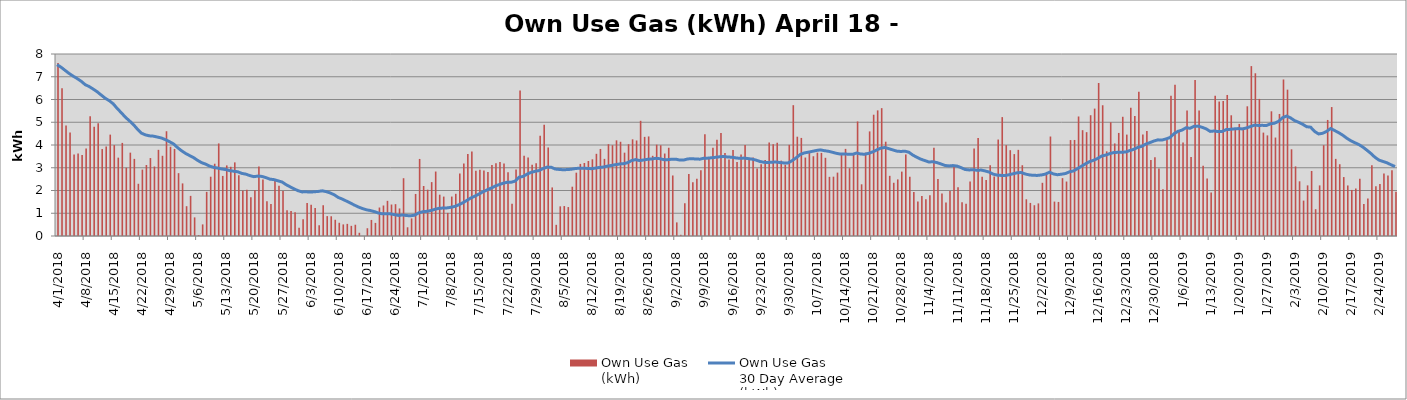
| Category | Own Use Gas
(kWh) |
|---|---|
| 4/1/18 | 7604219 |
| 4/2/18 | 6491744 |
| 4/3/18 | 4853061 |
| 4/4/18 | 4548355 |
| 4/5/18 | 3579529 |
| 4/6/18 | 3626281 |
| 4/7/18 | 3556372 |
| 4/8/18 | 3841883 |
| 4/9/18 | 5265679 |
| 4/10/18 | 4807054 |
| 4/11/18 | 4959534 |
| 4/12/18 | 3821856 |
| 4/13/18 | 3934795 |
| 4/14/18 | 4456419 |
| 4/15/18 | 3995686 |
| 4/16/18 | 3444380 |
| 4/17/18 | 4092522 |
| 4/18/18 | 2999712 |
| 4/19/18 | 3664195 |
| 4/20/18 | 3390440 |
| 4/21/18 | 2295820 |
| 4/22/18 | 2918571 |
| 4/23/18 | 3119473 |
| 4/24/18 | 3425965 |
| 4/25/18 | 3055632 |
| 4/26/18 | 3787600 |
| 4/27/18 | 3525448 |
| 4/28/18 | 4605379 |
| 4/29/18 | 3923695 |
| 4/30/18 | 3827817 |
| 5/1/18 | 2762231 |
| 5/2/18 | 2312007 |
| 5/3/18 | 1310460 |
| 5/4/18 | 1764184 |
| 5/5/18 | 818415 |
| 5/6/18 | 40935 |
| 5/7/18 | 510015 |
| 5/8/18 | 1940158 |
| 5/9/18 | 2606521 |
| 5/10/18 | 3176745 |
| 5/11/18 | 4069107 |
| 5/12/18 | 2640340 |
| 5/13/18 | 3103173 |
| 5/14/18 | 3042330 |
| 5/15/18 | 3236328 |
| 5/16/18 | 2675160 |
| 5/17/18 | 1992898 |
| 5/18/18 | 2037327 |
| 5/19/18 | 1704610 |
| 5/20/18 | 2014479 |
| 5/21/18 | 3053999 |
| 5/22/18 | 2483233 |
| 5/23/18 | 1526994 |
| 5/24/18 | 1411165 |
| 5/25/18 | 2440674 |
| 5/26/18 | 2206250 |
| 5/27/18 | 1974225 |
| 5/28/18 | 1132292 |
| 5/29/18 | 1096446 |
| 5/30/18 | 1046477 |
| 5/31/18 | 361289 |
| 6/1/18 | 736094 |
| 6/2/18 | 1445361 |
| 6/3/18 | 1376812 |
| 6/4/18 | 1236150 |
| 6/5/18 | 468116 |
| 6/6/18 | 1349756 |
| 6/7/18 | 874505 |
| 6/8/18 | 867596 |
| 6/9/18 | 713408 |
| 6/10/18 | 581199 |
| 6/11/18 | 509489 |
| 6/12/18 | 533323 |
| 6/13/18 | 446321 |
| 6/14/18 | 495564 |
| 6/15/18 | 141900 |
| 6/16/18 | 0 |
| 6/17/18 | 341236 |
| 6/18/18 | 706149 |
| 6/19/18 | 576444 |
| 6/20/18 | 1251931 |
| 6/21/18 | 1341003 |
| 6/22/18 | 1545623 |
| 6/23/18 | 1383666 |
| 6/24/18 | 1399827 |
| 6/25/18 | 1211586 |
| 6/26/18 | 2539997 |
| 6/27/18 | 383186 |
| 6/28/18 | 773649 |
| 6/29/18 | 1848006 |
| 6/30/18 | 3387473 |
| 7/1/18 | 2199074 |
| 7/2/18 | 2036537 |
| 7/3/18 | 2368815 |
| 7/4/18 | 2833727 |
| 7/5/18 | 1816616 |
| 7/6/18 | 1733027 |
| 7/7/18 | 1015840 |
| 7/8/18 | 1733887 |
| 7/9/18 | 1854871 |
| 7/10/18 | 2742476 |
| 7/11/18 | 3182385 |
| 7/12/18 | 3609624 |
| 7/13/18 | 3716606 |
| 7/14/18 | 2863848 |
| 7/15/18 | 2913521 |
| 7/16/18 | 2882423 |
| 7/17/18 | 2807698 |
| 7/18/18 | 3119470 |
| 7/19/18 | 3201291 |
| 7/20/18 | 3254406 |
| 7/21/18 | 3182465 |
| 7/22/18 | 2801926 |
| 7/23/18 | 1416890 |
| 7/24/18 | 2918461 |
| 7/25/18 | 6392683 |
| 7/26/18 | 3529647 |
| 7/27/18 | 3450588 |
| 7/28/18 | 3127002 |
| 7/29/18 | 3194970 |
| 7/30/18 | 4410029 |
| 7/31/18 | 4891461 |
| 8/1/18 | 3891495 |
| 8/2/18 | 2135240 |
| 8/3/18 | 491338 |
| 8/4/18 | 1303550 |
| 8/5/18 | 1316972 |
| 8/6/18 | 1272202 |
| 8/7/18 | 2166942 |
| 8/8/18 | 2783573 |
| 8/9/18 | 3168484 |
| 8/10/18 | 3209022 |
| 8/11/18 | 3297647 |
| 8/12/18 | 3371180 |
| 8/13/18 | 3612652 |
| 8/14/18 | 3826515 |
| 8/15/18 | 3390599 |
| 8/16/18 | 4036481 |
| 8/17/18 | 3990651 |
| 8/18/18 | 4205036 |
| 8/19/18 | 4142135 |
| 8/20/18 | 3662849 |
| 8/21/18 | 4036648 |
| 8/22/18 | 4249897 |
| 8/23/18 | 4198969 |
| 8/24/18 | 5063236 |
| 8/25/18 | 4357627 |
| 8/26/18 | 4375991 |
| 8/27/18 | 3524859 |
| 8/28/18 | 4015144 |
| 8/29/18 | 3988317 |
| 8/30/18 | 3625184 |
| 8/31/18 | 3878922 |
| 9/1/18 | 2660335 |
| 9/2/18 | 598104 |
| 9/3/18 | 54057 |
| 9/4/18 | 1441218 |
| 9/5/18 | 2725989 |
| 9/6/18 | 2360739 |
| 9/7/18 | 2513630 |
| 9/8/18 | 2892306 |
| 9/9/18 | 4477611 |
| 9/10/18 | 3420924 |
| 9/11/18 | 3883693 |
| 9/12/18 | 4230060 |
| 9/13/18 | 4530631 |
| 9/14/18 | 3644434 |
| 9/15/18 | 3366628 |
| 9/16/18 | 3782998 |
| 9/17/18 | 3248374 |
| 9/18/18 | 3587421 |
| 9/19/18 | 4001731 |
| 9/20/18 | 3399590 |
| 9/21/18 | 3455766 |
| 9/22/18 | 2964071 |
| 9/23/18 | 3153972 |
| 9/24/18 | 3344561 |
| 9/25/18 | 4110291 |
| 9/26/18 | 4035237 |
| 9/27/18 | 4098998 |
| 9/28/18 | 3313368 |
| 9/29/18 | 3132970 |
| 9/30/18 | 4007726 |
| 10/1/18 | 5750263 |
| 10/2/18 | 4364546 |
| 10/3/18 | 4311293 |
| 10/4/18 | 3447892 |
| 10/5/18 | 3677422 |
| 10/6/18 | 3505811 |
| 10/7/18 | 3663689 |
| 10/8/18 | 3652928 |
| 10/9/18 | 3437332 |
| 10/10/18 | 2600140 |
| 10/11/18 | 2608441 |
| 10/12/18 | 2786392 |
| 10/13/18 | 3561824 |
| 10/14/18 | 3829575 |
| 10/15/18 | 2978901 |
| 10/16/18 | 3635553 |
| 10/17/18 | 5035466 |
| 10/18/18 | 2272109 |
| 10/19/18 | 3662763 |
| 10/20/18 | 4598115 |
| 10/21/18 | 5331330 |
| 10/22/18 | 5521651 |
| 10/23/18 | 5619991 |
| 10/24/18 | 4145277 |
| 10/25/18 | 2645130 |
| 10/26/18 | 2339997 |
| 10/27/18 | 2488493 |
| 10/28/18 | 2830435 |
| 10/29/18 | 3585421 |
| 10/30/18 | 2607225 |
| 10/31/18 | 1930565 |
| 11/1/18 | 1520555 |
| 11/2/18 | 1761015 |
| 11/3/18 | 1620084 |
| 11/4/18 | 1792837 |
| 11/5/18 | 3877501 |
| 11/6/18 | 2501289 |
| 11/7/18 | 1868413 |
| 11/8/18 | 1472312 |
| 11/9/18 | 1980678 |
| 11/10/18 | 3064920 |
| 11/11/18 | 2141304 |
| 11/12/18 | 1478104 |
| 11/13/18 | 1415358 |
| 11/14/18 | 2394046 |
| 11/15/18 | 3850420 |
| 11/16/18 | 4312572 |
| 11/17/18 | 2609123 |
| 11/18/18 | 2464988 |
| 11/19/18 | 3108940 |
| 11/20/18 | 2613583 |
| 11/21/18 | 4240117 |
| 11/22/18 | 5226218 |
| 11/23/18 | 3994059 |
| 11/24/18 | 3772127 |
| 11/25/18 | 3600013 |
| 11/26/18 | 3787030 |
| 11/27/18 | 3109568 |
| 11/28/18 | 1613586 |
| 11/29/18 | 1454207 |
| 11/30/18 | 1352491 |
| 12/1/18 | 1433441 |
| 12/2/18 | 2338054 |
| 12/3/18 | 2728401 |
| 12/4/18 | 4372835 |
| 12/5/18 | 1512374 |
| 12/6/18 | 1497217 |
| 12/7/18 | 2543813 |
| 12/8/18 | 2394306 |
| 12/9/18 | 4216881 |
| 12/10/18 | 4221354 |
| 12/11/18 | 5253687 |
| 12/12/18 | 4651457 |
| 12/13/18 | 4564386 |
| 12/14/18 | 5308966 |
| 12/15/18 | 5600142 |
| 12/16/18 | 6725222 |
| 12/17/18 | 5746809 |
| 12/18/18 | 3721364 |
| 12/19/18 | 5001629 |
| 12/20/18 | 4069107 |
| 12/21/18 | 4530192 |
| 12/22/18 | 5240766 |
| 12/23/18 | 4457380 |
| 12/24/18 | 5639992 |
| 12/25/18 | 5269476 |
| 12/26/18 | 6340581 |
| 12/27/18 | 4459781 |
| 12/28/18 | 4611536 |
| 12/29/18 | 3341997 |
| 12/30/18 | 3460668 |
| 12/31/18 | 2970453 |
| 1/1/19 | 2053639 |
| 1/2/19 | 4221164 |
| 1/3/19 | 6166634 |
| 1/4/19 | 6645270 |
| 1/5/19 | 4639067 |
| 1/6/19 | 4114658 |
| 1/7/19 | 5518172.253 |
| 1/8/19 | 3467930 |
| 1/9/19 | 6857071 |
| 1/10/19 | 5518428 |
| 1/11/19 | 3084467 |
| 1/12/19 | 2527960 |
| 1/13/19 | 1916725 |
| 1/14/19 | 6162336 |
| 1/15/19 | 5910273 |
| 1/16/19 | 5935096 |
| 1/17/19 | 6199672 |
| 1/18/19 | 5306133 |
| 1/19/19 | 4691081 |
| 1/20/19 | 4926649 |
| 1/21/19 | 4763266 |
| 1/22/19 | 5700728 |
| 1/23/19 | 7467788 |
| 1/24/19 | 7152641 |
| 1/25/19 | 6025691 |
| 1/26/19 | 4544770 |
| 1/27/19 | 4422194 |
| 1/28/19 | 5481207 |
| 1/29/19 | 4328026 |
| 1/30/19 | 5364271 |
| 1/31/19 | 6880632 |
| 2/1/19 | 6432707 |
| 2/2/19 | 3810957 |
| 2/3/19 | 3059490 |
| 2/4/19 | 2404128 |
| 2/5/19 | 1556073 |
| 2/6/19 | 2225264 |
| 2/7/19 | 2858930 |
| 2/8/19 | 1177714 |
| 2/9/19 | 2223996 |
| 2/10/19 | 3990553 |
| 2/11/19 | 5101458.736 |
| 2/12/19 | 5668032.446 |
| 2/13/19 | 3390388 |
| 2/14/19 | 3154720.419 |
| 2/15/19 | 2590195 |
| 2/16/19 | 2221488 |
| 2/17/19 | 2024753 |
| 2/18/19 | 2090017 |
| 2/19/19 | 2512907 |
| 2/20/19 | 1402616 |
| 2/21/19 | 1643340 |
| 2/22/19 | 3108947.864 |
| 2/23/19 | 2186641 |
| 2/24/19 | 2282099 |
| 2/25/19 | 2743460 |
| 2/26/19 | 2655822.596 |
| 2/27/19 | 2886635.035 |
| 2/28/19 | 1946167 |